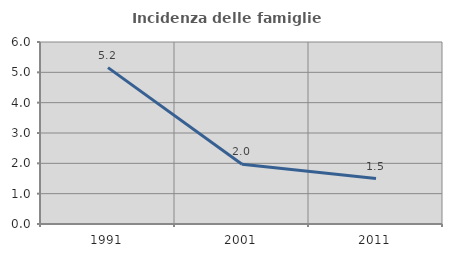
| Category | Incidenza delle famiglie numerose |
|---|---|
| 1991.0 | 5.155 |
| 2001.0 | 1.972 |
| 2011.0 | 1.497 |